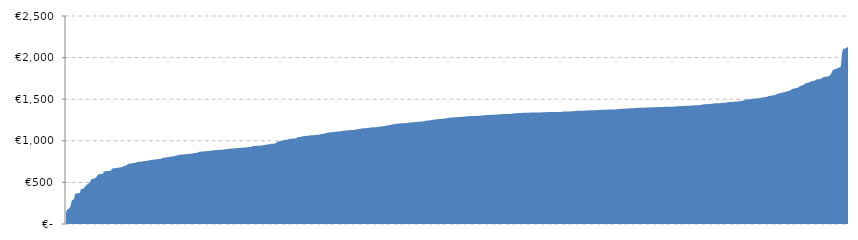
| Category | Totale |
|---|---|
| 1621 | 137.572 |
| 2105 | 173.437 |
| 1195 | 181.09 |
| 2776 | 190.487 |
| 9016 | 216.413 |
| 2899 | 285.484 |
| 2693 | 288.337 |
| 1273 | 303.136 |
| 3321 | 362.922 |
| 1266 | 366.109 |
| 2781 | 369.908 |
| 1599 | 371.212 |
| 2151 | 373.329 |
| 2038 | 420.244 |
| 931 | 420.358 |
| 2664 | 423.577 |
| 2700 | 443.253 |
| 2672 | 452.163 |
| 1249 | 473.224 |
| 1519 | 478.764 |
| 3319 | 492.091 |
| 1774 | 508.501 |
| 1814 | 538.622 |
| 3298 | 540.758 |
| 1784 | 546.21 |
| 1994 | 550.078 |
| 1972 | 556.184 |
| 2647 | 577.667 |
| 2654 | 593.51 |
| 3250 | 598.378 |
| 3158 | 600.675 |
| 2753 | 601.255 |
| 1791 | 602.938 |
| 1745 | 630.429 |
| 2661 | 633.625 |
| 1380 | 635.466 |
| 1841 | 636.218 |
| 3123 | 636.452 |
| 2594 | 639.57 |
| 2121 | 640.323 |
| 2652 | 667.275 |
| 3174 | 668.867 |
| 2786 | 671.021 |
| 3151 | 671.289 |
| 1798 | 674.568 |
| 1165 | 676.312 |
| 2653 | 676.678 |
| 2656 | 680.804 |
| 2770 | 681.045 |
| 3005 | 687.143 |
| 2774 | 693.015 |
| 2692 | 701.388 |
| 2687 | 701.426 |
| 3296 | 710.453 |
| 3241 | 722.898 |
| 2168 | 724.016 |
| 2749 | 724.309 |
| 3164 | 729.579 |
| 2648 | 733.326 |
| 2746 | 734.066 |
| 1842 | 734.573 |
| 2477 | 738.394 |
| 2788 | 745.303 |
| 1836 | 746.781 |
| 2783 | 747.246 |
| 3285 | 747.693 |
| 2735 | 751.479 |
| 3135 | 754.58 |
| 2710 | 756.976 |
| 2649 | 757.146 |
| 2845 | 758.205 |
| 1840 | 761.271 |
| 2696 | 765.6 |
| 3130 | 767.403 |
| 2476 | 767.96 |
| 2775 | 771.333 |
| 2658 | 772.688 |
| 3083 | 774.951 |
| 1790 | 777.605 |
| 2810 | 778.333 |
| 997 | 779.584 |
| 1816 | 780.27 |
| 2755 | 780.395 |
| 1980 | 790.275 |
| 1835 | 792.49 |
| 2359 | 796.98 |
| 2468 | 798.856 |
| 2748 | 800.866 |
| 2790 | 802.887 |
| 2676 | 804.149 |
| 1389 | 809.266 |
| 1846 | 809.697 |
| 2708 | 811.374 |
| 1399 | 813.421 |
| 1881 | 813.85 |
| 1129 | 820.039 |
| 2480 | 822.574 |
| 2741 | 826.558 |
| 2665 | 832.895 |
| 2674 | 833.653 |
| 2062 | 833.872 |
| 2671 | 834.8 |
| 1857 | 836.428 |
| 2888 | 837.899 |
| 2712 | 838.279 |
| 2739 | 840.93 |
| 2834 | 842.417 |
| 2684 | 844.255 |
| 1858 | 845.025 |
| 2758 | 845.253 |
| 1356 | 847.999 |
| 2742 | 852.184 |
| 2793 | 853.107 |
| 2705 | 854.714 |
| 2679 | 855.429 |
| 1797 | 865.021 |
| 2659 | 868.049 |
| 2773 | 868.894 |
| 2668 | 871.282 |
| 1198 | 871.326 |
| 2805 | 871.534 |
| 2655 | 875.33 |
| 1806 | 875.934 |
| 2889 | 877.593 |
| 1984 | 877.892 |
| 1965 | 878.702 |
| 2650 | 883.402 |
| 3092 | 884.14 |
| 2769 | 885.815 |
| 2675 | 886.599 |
| 2740 | 888.008 |
| 2130 | 889.184 |
| 2734 | 889.816 |
| 2383 | 890.533 |
| 1750 | 891.314 |
| 2569 | 891.35 |
| 2811 | 891.978 |
| 1242 | 893.178 |
| 2791 | 895.736 |
| 2787 | 899.79 |
| 1100 | 900.516 |
| 789 | 902.655 |
| 2579 | 905.263 |
| 2660 | 905.536 |
| 2702 | 906.532 |
| 2662 | 907.367 |
| 1256 | 908.402 |
| 1844 | 909.152 |
| 2809 | 909.589 |
| 3218 | 913.698 |
| 2478 | 913.706 |
| 1575 | 914.468 |
| 1132 | 916.003 |
| 2796 | 916.237 |
| 1845 | 918.297 |
| 2670 | 918.297 |
| 2900 | 918.297 |
| 1160 | 922.671 |
| 1785 | 923.798 |
| 1657 | 924.356 |
| 2761 | 925.121 |
| 2680 | 928.33 |
| 1481 | 936.58 |
| 2678 | 937.184 |
| 2677 | 938.771 |
| 2754 | 939.153 |
| 2901 | 939.551 |
| 2669 | 940.289 |
| 2084 | 940.805 |
| 2780 | 941.878 |
| 2806 | 943.764 |
| 2760 | 947.342 |
| 1739 | 947.368 |
| 1199 | 951.474 |
| 2494 | 954.914 |
| 1793 | 955.77 |
| 1201 | 958.53 |
| 1837 | 959.797 |
| 3059 | 964.416 |
| 2682 | 964.85 |
| 1942 | 965.595 |
| 1387 | 965.798 |
| 2800 | 968.975 |
| 2291 | 980.674 |
| 971 | 989.343 |
| 1138 | 994.271 |
| 2813 | 997.356 |
| 1856 | 999.736 |
| 3116 | 1000.44 |
| 1282 | 1005.709 |
| 3018 | 1011.751 |
| 2789 | 1011.781 |
| 2607 | 1013.807 |
| 1450 | 1019.826 |
| 2814 | 1019.976 |
| 2663 | 1024.459 |
| 1531 | 1026.619 |
| 2756 | 1026.834 |
| 2577 | 1027.573 |
| 2605 | 1028.202 |
| 2843 | 1030.318 |
| 3097 | 1041.873 |
| 1623 | 1044.27 |
| 2763 | 1044.428 |
| 1115 | 1046.803 |
| 2698 | 1053.095 |
| 1847 | 1053.792 |
| 3302 | 1054.682 |
| 1223 | 1056.999 |
| 3242 | 1060.112 |
| 2759 | 1060.545 |
| 1953 | 1061.057 |
| 2730 | 1065.937 |
| 1145 | 1066.878 |
| 2807 | 1066.878 |
| 2513 | 1067.18 |
| 1324 | 1069.085 |
| 2757 | 1070.146 |
| 1345 | 1073.374 |
| 3229 | 1073.558 |
| 2512 | 1074.057 |
| 1826 | 1081.396 |
| 1820 | 1082.302 |
| 1468 | 1084.188 |
| 2804 | 1084.268 |
| 3222 | 1086.717 |
| 2722 | 1093.936 |
| 2852 | 1096.943 |
| 2582 | 1098.273 |
| 3077 | 1101.511 |
| 2866 | 1102.059 |
| 1378 | 1103.186 |
| 2737 | 1104.408 |
| 2717 | 1105.593 |
| 1411 | 1108.864 |
| 2798 | 1110.091 |
| 3093 | 1110.334 |
| 2003 | 1110.471 |
| 1600 | 1111.209 |
| 2729 | 1117.41 |
| 2799 | 1118.219 |
| 2064 | 1121.552 |
| 1219 | 1121.848 |
| 2940 | 1123.561 |
| 3041 | 1124.335 |
| 1393 | 1126.013 |
| 1245 | 1127.258 |
| 1241 | 1128.542 |
| 2616 | 1129.167 |
| 1807 | 1130.931 |
| 2066 | 1130.987 |
| 2745 | 1131.245 |
| 2690 | 1136.016 |
| 1347 | 1139.944 |
| 2721 | 1139.953 |
| 1752 | 1143.717 |
| 2747 | 1145.739 |
| 3147 | 1146.917 |
| 2510 | 1151.102 |
| 3268 | 1151.869 |
| 1479 | 1152.04 |
| 2784 | 1152.19 |
| 767 | 1152.714 |
| 1968 | 1155.581 |
| 3108 | 1159.059 |
| 2720 | 1161.036 |
| 1631 | 1161.344 |
| 2048 | 1161.469 |
| 3028 | 1161.811 |
| 2797 | 1162.074 |
| 3014 | 1165.553 |
| 1326 | 1166.902 |
| 1853 | 1170.151 |
| 1459 | 1171.322 |
| 2907 | 1172.722 |
| 2373 | 1175.131 |
| 2771 | 1175.979 |
| 1815 | 1177.197 |
| 1197 | 1182.877 |
| 2772 | 1183.157 |
| 2632 | 1185.607 |
| 1772 | 1188.992 |
| 3217 | 1190.338 |
| 2785 | 1196.682 |
| 2058 | 1198.041 |
| 2639 | 1199.357 |
| 1492 | 1203.097 |
| 1440 | 1204.446 |
| 2409 | 1206.363 |
| 2689 | 1206.52 |
| 2823 | 1208.891 |
| 2578 | 1209.884 |
| 2862 | 1210.183 |
| 2733 | 1210.906 |
| 2844 | 1211.299 |
| 3311 | 1212.993 |
| 1848 | 1213.231 |
| 1340 | 1217.363 |
| 1596 | 1219.283 |
| 3148 | 1219.396 |
| 2751 | 1220.402 |
| 1445 | 1221.393 |
| 1650 | 1223.368 |
| 2615 | 1224.259 |
| 2596 | 1227.117 |
| 979 | 1227.806 |
| 2584 | 1228.445 |
| 2801 | 1229.295 |
| 2617 | 1230.71 |
| 1729 | 1232.623 |
| 1880 | 1233.002 |
| 2713 | 1233.476 |
| 3031 | 1240.481 |
| 3223 | 1242.16 |
| 2819 | 1243.04 |
| 2762 | 1244.304 |
| 1164 | 1245.874 |
| 2474 | 1246.446 |
| 2726 | 1251.67 |
| 3110 | 1252.473 |
| 2919 | 1255.243 |
| 2037 | 1257.311 |
| 2918 | 1257.98 |
| 2963 | 1258.061 |
| 1567 | 1260.621 |
| 1022 | 1260.921 |
| 3202 | 1262.793 |
| 2172 | 1262.867 |
| 3144 | 1265.39 |
| 1673 | 1269.534 |
| 3049 | 1270.757 |
| 1735 | 1271.735 |
| 2610 | 1275.799 |
| 1979 | 1277.724 |
| 2009 | 1278.2 |
| 3214 | 1279.45 |
| 2092 | 1279.566 |
| 2595 | 1281.352 |
| 2041 | 1282.568 |
| 1705 | 1283.324 |
| 1170 | 1284.786 |
| 2891 | 1285.88 |
| 1940 | 1285.997 |
| 2126 | 1286.291 |
| 1684 | 1288.392 |
| 2039 | 1289.755 |
| 1175 | 1291.293 |
| 3216 | 1291.838 |
| 1693 | 1292.949 |
| 1801 | 1296.301 |
| 3271 | 1296.481 |
| 2997 | 1296.714 |
| 3113 | 1296.841 |
| 3000 | 1296.907 |
| 3098 | 1296.943 |
| 1453 | 1297.543 |
| 3112 | 1298.563 |
| 764 | 1298.758 |
| 2572 | 1300.783 |
| 2876 | 1300.783 |
| 2154 | 1300.984 |
| 2521 | 1304.112 |
| 1773 | 1305.877 |
| 2593 | 1308.093 |
| 1852 | 1308.503 |
| 2837 | 1308.822 |
| 3060 | 1308.868 |
| 834 | 1310.055 |
| 3179 | 1310.295 |
| 3153 | 1311.764 |
| 3266 | 1311.764 |
| 1476 | 1312.908 |
| 1878 | 1314.071 |
| 1533 | 1314.204 |
| 2981 | 1315.146 |
| 3267 | 1315.186 |
| 787 | 1318.158 |
| 1285 | 1319.778 |
| 1787 | 1320.187 |
| 2970 | 1320.274 |
| 2193 | 1321.165 |
| 2704 | 1321.863 |
| 2509 | 1322.616 |
| 2612 | 1323.019 |
| 2987 | 1323.019 |
| 2881 | 1323.452 |
| 1990 | 1324.989 |
| 2855 | 1326.49 |
| 2174 | 1326.76 |
| 1461 | 1327.968 |
| 3143 | 1330.635 |
| 2600 | 1331.526 |
| 2887 | 1333.083 |
| 3160 | 1334.324 |
| 2588 | 1335.148 |
| 2065 | 1335.178 |
| 3307 | 1335.371 |
| 1988 | 1335.874 |
| 1348 | 1335.927 |
| 3055 | 1336.145 |
| 2920 | 1337.045 |
| 1716 | 1338.19 |
| 2067 | 1338.19 |
| 3165 | 1338.831 |
| 2552 | 1339.146 |
| 2109 | 1340.258 |
| 1730 | 1340.638 |
| 3105 | 1341.276 |
| 1731 | 1341.303 |
| 2840 | 1341.303 |
| 2822 | 1341.303 |
| 2288 | 1341.475 |
| 3220 | 1341.607 |
| 2622 | 1341.629 |
| 3249 | 1342.233 |
| 3189 | 1342.233 |
| 1634 | 1342.504 |
| 1707 | 1344.123 |
| 1782 | 1345.232 |
| 3162 | 1345.328 |
| 3133 | 1345.328 |
| 2995 | 1345.328 |
| 2101 | 1345.339 |
| 3002 | 1345.339 |
| 3042 | 1346.082 |
| 3107 | 1346.124 |
| 3299 | 1346.124 |
| 2537 | 1346.351 |
| 3152 | 1346.351 |
| 3004 | 1346.351 |
| 2592 | 1348.047 |
| 2962 | 1350.468 |
| 1702 | 1350.953 |
| 3081 | 1350.953 |
| 2842 | 1351.518 |
| 2868 | 1351.987 |
| 1173 | 1352.672 |
| 2606 | 1353.213 |
| 3173 | 1353.304 |
| 1297 | 1353.905 |
| 2389 | 1355.586 |
| 2238 | 1355.869 |
| 1550 | 1357.262 |
| 3091 | 1357.33 |
| 1397 | 1359.949 |
| 3225 | 1359.949 |
| 9015 | 1360.525 |
| 2946 | 1361.447 |
| 2975 | 1361.447 |
| 2390 | 1361.88 |
| 3163 | 1361.88 |
| 3154 | 1364.587 |
| 2709 | 1364.599 |
| 3192 | 1365.296 |
| 2839 | 1365.347 |
| 3215 | 1365.978 |
| 3238 | 1367.052 |
| 2556 | 1367.104 |
| 2382 | 1367.593 |
| 3017 | 1368.073 |
| 1648 | 1368.232 |
| 2999 | 1368.309 |
| 1715 | 1369.191 |
| 3221 | 1370.061 |
| 3104 | 1371.465 |
| 2113 | 1372.427 |
| 3150 | 1372.427 |
| 2076 | 1372.898 |
| 2232 | 1372.942 |
| 2945 | 1374.245 |
| 2723 | 1374.877 |
| 3270 | 1374.978 |
| 3124 | 1375.002 |
| 3273 | 1375.074 |
| 2870 | 1375.226 |
| 2699 | 1375.315 |
| 3078 | 1375.591 |
| 1897 | 1377.101 |
| 1889 | 1377.101 |
| 1436 | 1380.015 |
| 3050 | 1383.127 |
| 1443 | 1383.275 |
| 2923 | 1383.588 |
| 1854 | 1384.568 |
| 2921 | 1385.078 |
| 3039 | 1385.614 |
| 1718 | 1387.004 |
| 2943 | 1387.454 |
| 3155 | 1387.793 |
| 1462 | 1389.411 |
| 1694 | 1389.885 |
| 1936 | 1390.316 |
| 3057 | 1391.274 |
| 2536 | 1391.71 |
| 3272 | 1394.722 |
| 1598 | 1394.757 |
| 1105 | 1394.871 |
| 3061 | 1395.626 |
| 2906 | 1395.966 |
| 1460 | 1396.632 |
| 2686 | 1398.438 |
| 1628 | 1398.528 |
| 2614 | 1398.528 |
| 3248 | 1398.803 |
| 1969 | 1399.102 |
| 2602 | 1399.617 |
| 2728 | 1400.418 |
| 2598 | 1400.529 |
| 3079 | 1401.247 |
| 3137 | 1402.351 |
| 3118 | 1402.715 |
| 2898 | 1403.059 |
| 2534 | 1403.333 |
| 2978 | 1404.017 |
| 1455 | 1405.298 |
| 3245 | 1405.298 |
| 1529 | 1405.955 |
| 1763 | 1406.154 |
| 3068 | 1407.315 |
| 1359 | 1407.427 |
| 1696 | 1408.079 |
| 2149 | 1408.079 |
| 2882 | 1408.079 |
| 2625 | 1408.187 |
| 1053 | 1410.385 |
| 2583 | 1410.385 |
| 3193 | 1410.385 |
| 2619 | 1410.385 |
| 1262 | 1411.228 |
| 1908 | 1411.571 |
| 2575 | 1414.037 |
| 960 | 1414.189 |
| 2473 | 1414.409 |
| 3230 | 1414.409 |
| 1838 | 1416.852 |
| 1068 | 1418.395 |
| 3269 | 1418.665 |
| 3034 | 1418.665 |
| 3022 | 1421.143 |
| 3140 | 1421.143 |
| 3146 | 1421.143 |
| 9008 | 1421.143 |
| 3142 | 1421.143 |
| 3206 | 1422.603 |
| 1439 | 1424.074 |
| 1471 | 1424.074 |
| 3010 | 1427.173 |
| 1761 | 1427.266 |
| 1354 | 1427.355 |
| 2627 | 1427.879 |
| 2439 | 1428.603 |
| 1562 | 1431.536 |
| 2437 | 1431.742 |
| 2036 | 1437.367 |
| 2711 | 1438.58 |
| 1938 | 1439.614 |
| 1674 | 1439.961 |
| 2731 | 1440.653 |
| 1937 | 1442.54 |
| 1325 | 1442.892 |
| 2580 | 1444.269 |
| 1259 | 1446.402 |
| 2386 | 1449.081 |
| 2716 | 1449.895 |
| 1322 | 1450.538 |
| 2706 | 1450.755 |
| 2695 | 1450.949 |
| 2097 | 1451.63 |
| 2825 | 1451.63 |
| 1148 | 1454.884 |
| 1884 | 1455.434 |
| 3111 | 1456.047 |
| 3134 | 1456.047 |
| 1834 | 1456.469 |
| 3187 | 1462.009 |
| 2357 | 1464.881 |
| 2377 | 1464.881 |
| 2102 | 1464.881 |
| 2398 | 1464.881 |
| 3099 | 1464.881 |
| 3089 | 1470.038 |
| 2371 | 1472.242 |
| 2875 | 1472.242 |
| 3109 | 1472.242 |
| 3045 | 1472.242 |
| 2604 | 1475.504 |
| 2547 | 1477.149 |
| 2576 | 1479.227 |
| 1156 | 1482.598 |
| 1727 | 1488.204 |
| 3032 | 1494.44 |
| 3069 | 1496.537 |
| 3094 | 1498.76 |
| 3073 | 1499.172 |
| 1803 | 1499.563 |
| 1187 | 1500.873 |
| 2718 | 1501.171 |
| 1495 | 1508.091 |
| 3244 | 1508.796 |
| 1206 | 1508.916 |
| 2469 | 1509.126 |
| 3085 | 1510.945 |
| 1268 | 1511.829 |
| 2634 | 1514.472 |
| 2540 | 1518.561 |
| 1446 | 1521.716 |
| 2724 | 1522.293 |
| 1652 | 1525.065 |
| 3121 | 1527.64 |
| 1568 | 1528.998 |
| 1501 | 1536.11 |
| 1480 | 1540.712 |
| 1024 | 1542.141 |
| 2599 | 1543.48 |
| 1802 | 1545.492 |
| 3228 | 1548.136 |
| 1361 | 1552.4 |
| 1958 | 1555.965 |
| 3243 | 1569.695 |
| 1503 | 1569.826 |
| 1183 | 1570.208 |
| 2965 | 1576.387 |
| 2777 | 1579.484 |
| 1811 | 1580.013 |
| 2913 | 1583.799 |
| 2520 | 1590.98 |
| 1500 | 1593.291 |
| 1960 | 1597.713 |
| 2644 | 1598.827 |
| 1832 | 1604.987 |
| 1260 | 1617.459 |
| 1215 | 1624.643 |
| 1135 | 1625.354 |
| 922 | 1630.931 |
| 2714 | 1634.591 |
| 1744 | 1636.119 |
| 1863 | 1638.827 |
| 2859 | 1654.708 |
| 1508 | 1659.9 |
| 2132 | 1662.927 |
| 1904 | 1667.935 |
| 2645 | 1677.037 |
| 2299 | 1690.858 |
| 1947 | 1694.835 |
| 2815 | 1695.135 |
| 1989 | 1701.972 |
| 1617 | 1704.925 |
| 996 | 1713.473 |
| 2156 | 1717.197 |
| 1417 | 1717.34 |
| 1890 | 1720.306 |
| 1672 | 1731.427 |
| 1777 | 1738.725 |
| 1438 | 1740.018 |
| 1221 | 1740.225 |
| 1496 | 1740.675 |
| 1289 | 1748.005 |
| 2225 | 1759.581 |
| 1437 | 1764.465 |
| 2630 | 1769.282 |
| 1641 | 1769.476 |
| 1214 | 1772.995 |
| 1231 | 1773.394 |
| 2581 | 1779.965 |
| 1627 | 1797.61 |
| 995 | 1818.578 |
| 1224 | 1851.994 |
| 2821 | 1853.752 |
| 1456 | 1862.019 |
| 1671 | 1862.664 |
| 1710 | 1875.469 |
| 1395 | 1876.153 |
| 1566 | 1884.556 |
| 1284 | 1898.137 |
| 1499 | 2058.49 |
| 1472 | 2105.713 |
| 3035 | 2105.713 |
| 1570 | 2112.152 |
| 2427 | 2117.821 |
| 1505 | 2129.324 |
| 2642 | 2129.324 |